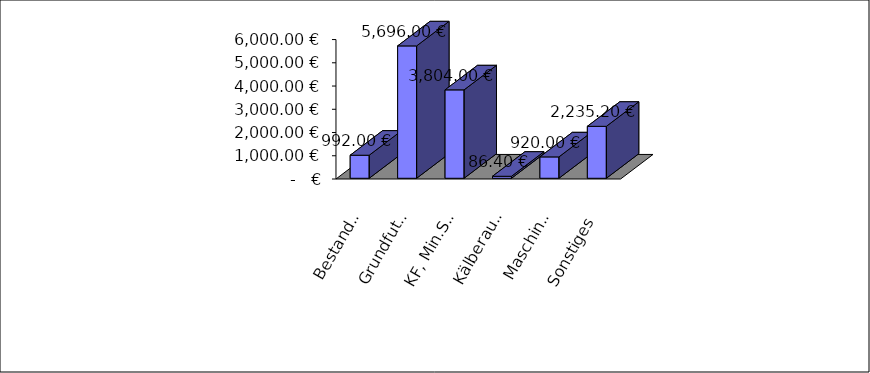
| Category | Series 0 |
|---|---|
| Bestandesergänzung | 992 |
| Grundfutter | 5696 |
| KF, Min.Stoffe | 3804 |
| Kälberaufzucht | 86.4 |
| Maschinen- und Energiekosten | 920 |
| Sonstiges | 2235.2 |